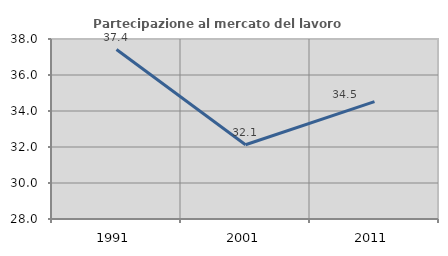
| Category | Partecipazione al mercato del lavoro  femminile |
|---|---|
| 1991.0 | 37.414 |
| 2001.0 | 32.123 |
| 2011.0 | 34.517 |